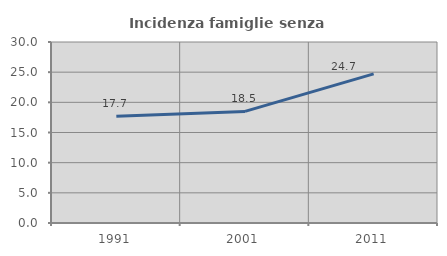
| Category | Incidenza famiglie senza nuclei |
|---|---|
| 1991.0 | 17.698 |
| 2001.0 | 18.498 |
| 2011.0 | 24.724 |